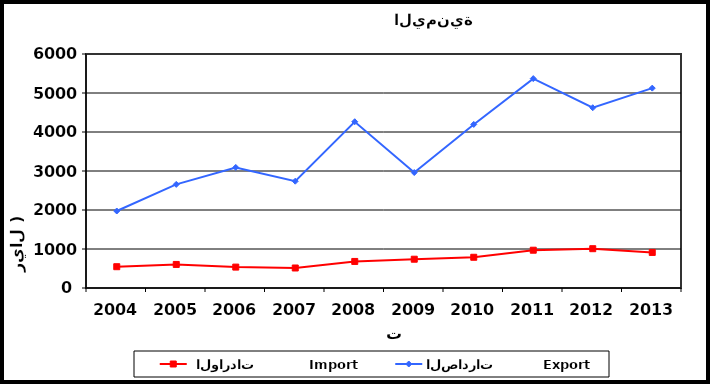
| Category |  الواردات           Import | الصادرات          Export |
|---|---|---|
| 2004.0 | 546 | 1974 |
| 2005.0 | 604 | 2657 |
| 2006.0 | 536 | 3091 |
| 2007.0 | 513 | 2738 |
| 2008.0 | 681 | 4263 |
| 2009.0 | 738 | 2961 |
| 2010.0 | 788 | 4194 |
| 2011.0 | 969 | 5369 |
| 2012.0 | 1008 | 4622 |
| 2013.0 | 912 | 5125 |